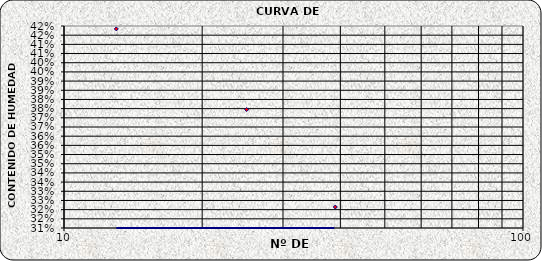
| Category | Series 0 |
|---|---|
| 39.0 | 0.321 |
| 25.0 | 0.375 |
| 13.0 | 0.418 |